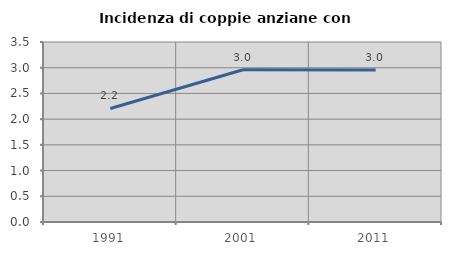
| Category | Incidenza di coppie anziane con figli |
|---|---|
| 1991.0 | 2.208 |
| 2001.0 | 2.96 |
| 2011.0 | 2.954 |